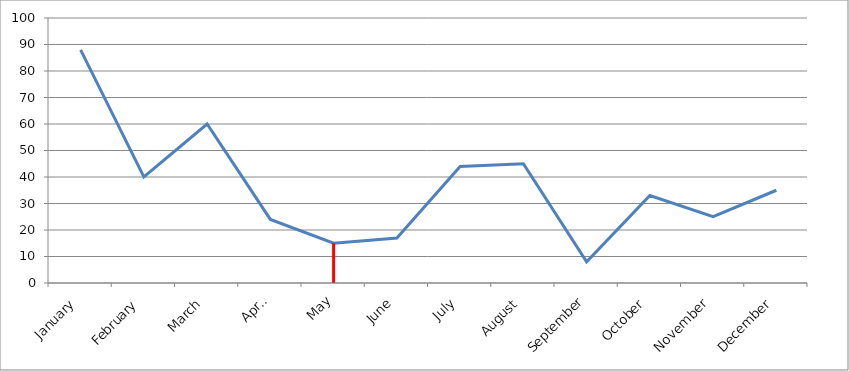
| Category | Total Income |
|---|---|
| January | 88 |
| February | 40 |
| March | 60 |
| April | 24 |
| May | 15 |
| June | 17 |
| July | 44 |
| August | 45 |
| September | 8 |
| October | 33 |
| November | 25 |
| December | 35 |